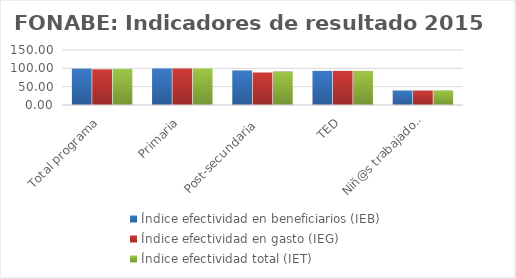
| Category | Índice efectividad en beneficiarios (IEB) | Índice efectividad en gasto (IEG)  | Índice efectividad total (IET) |
|---|---|---|---|
| Total programa | 99.031 | 97.319 | 98.175 |
| Primaria | 99.641 | 99.639 | 99.64 |
| Post-secundaria  | 94.001 | 88.688 | 91.345 |
| TED | 93.071 | 93.074 | 93.072 |
| Niñ@s trabajadores | 39.47 | 39.394 | 39.432 |